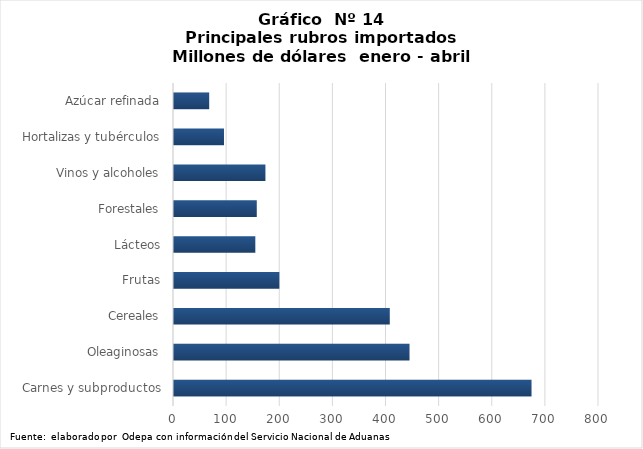
| Category | Series 0 |
|---|---|
| Carnes y subproductos | 672992.653 |
| Oleaginosas | 443325.803 |
| Cereales | 406186.844 |
| Frutas | 198303 |
| Lácteos | 153086.157 |
| Forestales | 155822 |
| Vinos y alcoholes | 172098.128 |
| Hortalizas y tubérculos | 94109.99 |
| Azúcar refinada | 66259.008 |